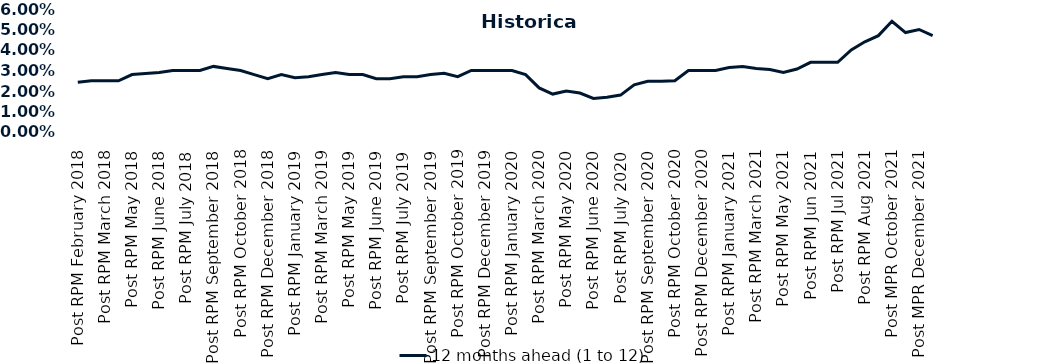
| Category | 12 months ahead (1 to 12)  |
|---|---|
| Post RPM February 2018 | 0.024 |
| Pre RPM March 2018 | 0.025 |
| Post RPM March 2018 | 0.025 |
| Pre RPM May 2018 | 0.025 |
| Post RPM May 2018 | 0.028 |
| Pre RPM June 2018 | 0.028 |
| Post RPM June 2018 | 0.029 |
| Pre RPM July 2018 | 0.03 |
| Post RPM July 2018 | 0.03 |
| Pre RPM September 2018 | 0.03 |
| Post RPM September 2018 | 0.032 |
| Pre RPM October 2018 | 0.031 |
| Post RPM October 2018 | 0.03 |
| Pre RPM December 2018 | 0.028 |
| Post RPM December 2018 | 0.026 |
| Pre RPM January 2019 | 0.028 |
| Post RPM January 2019 | 0.026 |
| Pre RPM March 2019 | 0.027 |
| Post RPM March 2019 | 0.028 |
| Pre RPM May 2019 | 0.029 |
| Post RPM May 2019 | 0.028 |
| Pre RPM June 2019 | 0.028 |
| Post RPM June 2019 | 0.026 |
| Pre RPM July 2019 | 0.026 |
| Post RPM July 2019 | 0.027 |
| Pre RPM September 2019 | 0.027 |
| Post RPM September 2019 | 0.028 |
| Pre RPM October 2019 | 0.029 |
| Post RPM October 2019 | 0.027 |
| Pre RPM December 2019 | 0.03 |
| Post RPM December 2019 | 0.03 |
| Pre RPM January 2020 | 0.03 |
| Post RPM January 2020 | 0.03 |
| Pre RPM March 2020 | 0.028 |
| Post RPM March 2020 | 0.022 |
| Pre RPM May 2020 | 0.018 |
| Post RPM May 2020 | 0.02 |
| Pre RPM June 2020 | 0.019 |
| Post RPM June 2020 | 0.016 |
| Pre RPM July 2020 | 0.017 |
| Post RPM July 2020 | 0.018 |
| Pre RPM September 2020 | 0.023 |
| Post RPM September 2020 | 0.025 |
| Pre RPM October 2020 | 0.025 |
| Post RPM October 2020 | 0.025 |
| Pre RPM December 2020 | 0.03 |
|  Post RPM December 2020 | 0.03 |
| Pre RPM January 2021 | 0.03 |
| Post RPM January 2021 | 0.032 |
|  Pre RPM March 2021 | 0.032 |
|  Post RPM March 2021 | 0.031 |
|  Pre RPM May 2021 | 0.03 |
|  Post RPM May 2021 | 0.029 |
|  Pre RPM Jun 2021 | 0.031 |
|   Post RPM Jun 2021 | 0.034 |
| Pre RPM Jul 2021 | 0.034 |
|  Post RPM Jul 2021 | 0.034 |
| Pre RPM Aug 2021 | 0.04 |
|  Post RPM Aug 2021 | 0.044 |
| Pre MPR October 2021 | 0.047 |
| Post MPR October 2021 | 0.054 |
| Pre MPR December 2021 | 0.048 |
| Post MPR December 2021 | 0.05 |
| Pre MPR January 2022 | 0.047 |